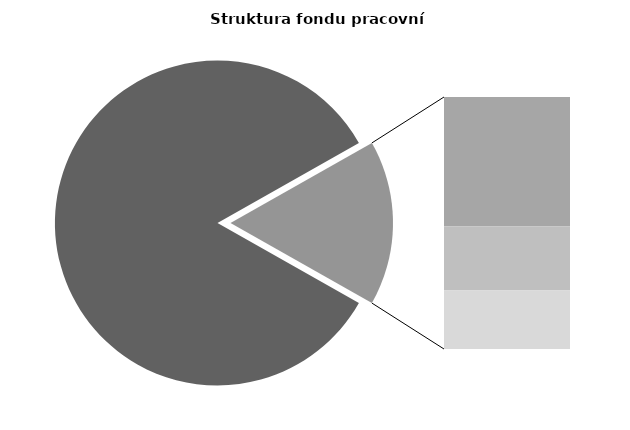
| Category | Series 0 |
|---|---|
| Průměrná měsíční odpracovaná doba bez přesčasu | 142.144 |
| Dovolená | 14.313 |
| Nemoc | 7.091 |
| Jiné | 6.48 |